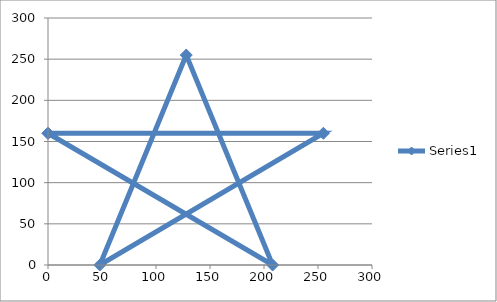
| Category | Series 0 |
|---|---|
| 0.0 | 160 |
| 255.0 | 160 |
| 48.0 | 0 |
| 128.0 | 255 |
| 208.0 | 0 |
| 0.0 | 160 |